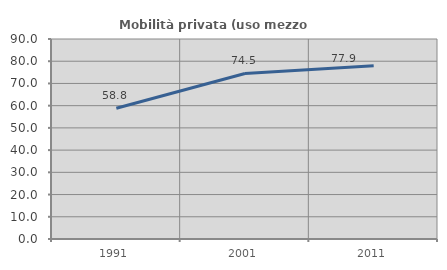
| Category | Mobilità privata (uso mezzo privato) |
|---|---|
| 1991.0 | 58.845 |
| 2001.0 | 74.496 |
| 2011.0 | 77.944 |